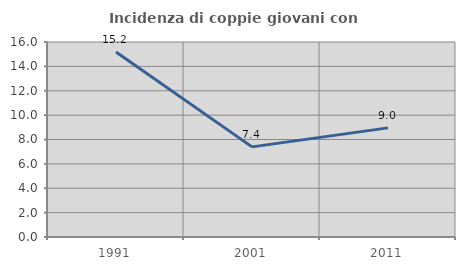
| Category | Incidenza di coppie giovani con figli |
|---|---|
| 1991.0 | 15.174 |
| 2001.0 | 7.394 |
| 2011.0 | 8.953 |